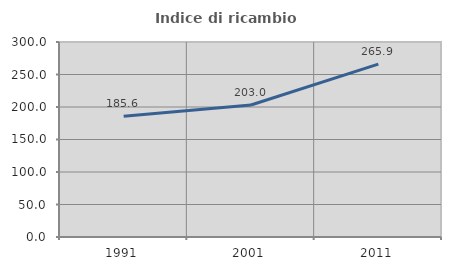
| Category | Indice di ricambio occupazionale  |
|---|---|
| 1991.0 | 185.616 |
| 2001.0 | 203.03 |
| 2011.0 | 265.909 |